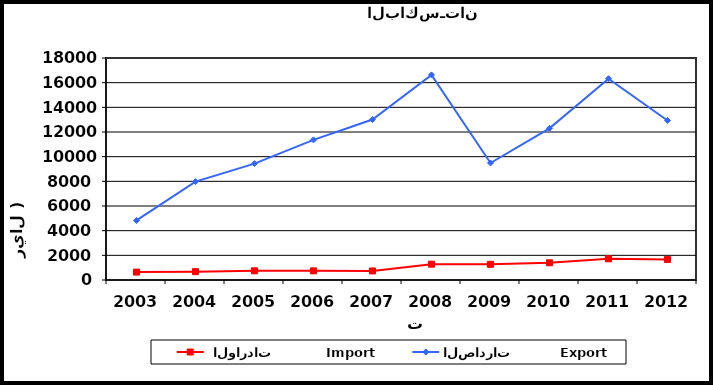
| Category |  الواردات           Import | الصادرات          Export |
|---|---|---|
| 2003.0 | 642 | 4828 |
| 2004.0 | 677 | 7979 |
| 2005.0 | 746 | 9435 |
| 2006.0 | 741 | 11363 |
| 2007.0 | 734 | 13015 |
| 2008.0 | 1283 | 16630 |
| 2009.0 | 1271 | 9487 |
| 2010.0 | 1394 | 12298 |
| 2011.0 | 1719 | 16323 |
| 2012.0 | 1666 | 12933 |